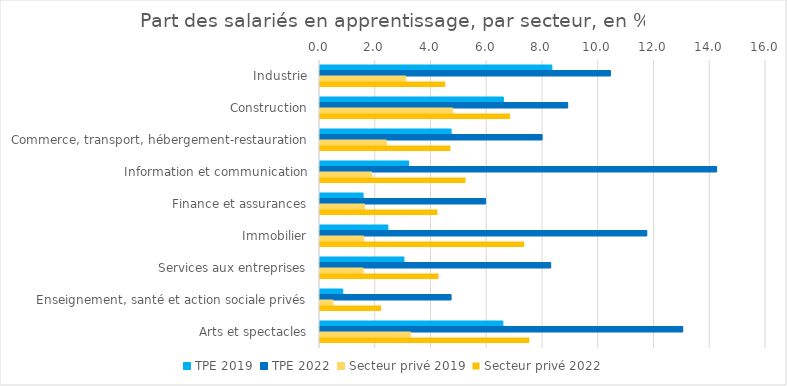
| Category | TPE 2019 | TPE 2022 | Secteur privé 2019 | Secteur privé 2022 |
|---|---|---|---|---|
| Industrie | 8.318 | 10.42 | 3.076 | 4.493 |
| Construction | 6.578 | 8.886 | 4.767 | 6.82 |
| Commerce, transport, hébergement-restauration | 4.704 | 7.968 | 2.385 | 4.677 |
| Information et communication | 3.181 | 14.23 | 1.859 | 5.222 |
| Finance et assurances | 1.546 | 5.942 | 1.6 | 4.212 |
| Immobilier | 2.436 | 11.725 | 1.573 | 7.325 |
| Services aux entreprises | 3.012 | 8.276 | 1.553 | 4.252 |
| Enseignement, santé et action sociale privés | 0.817 | 4.703 | 0.467 | 2.193 |
| Arts et spectacles | 6.561 | 13.014 | 3.251 | 7.51 |